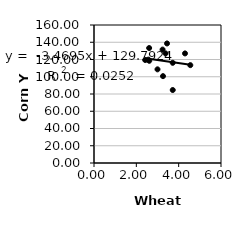
| Category | Series 0 |
|---|---|
| 2.42 | 119.375 |
| 2.57 | 119.844 |
| 3.72 | 84.613 |
| 3.72 | 116.165 |
| 2.61 | 118.503 |
| 3.0 | 108.581 |
| 3.24 | 131.48 |
| 3.26 | 100.705 |
| 3.45 | 138.608 |
| 4.55 | 113.453 |
| 4.3 | 127.051 |
| 3.38 | 127.043 |
| 2.6054916274 | 133.3 |